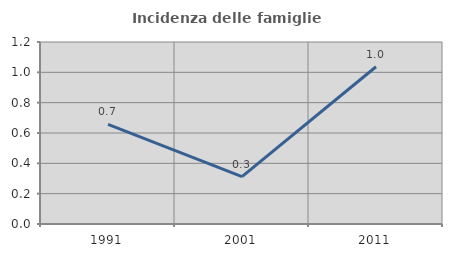
| Category | Incidenza delle famiglie numerose |
|---|---|
| 1991.0 | 0.657 |
| 2001.0 | 0.312 |
| 2011.0 | 1.037 |